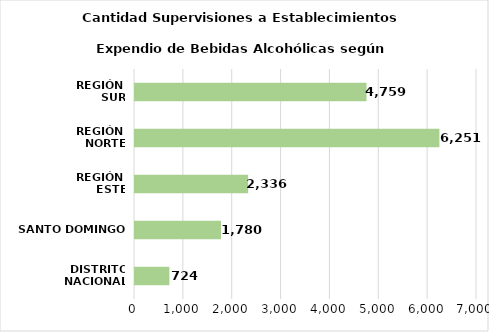
| Category | Series 0 |
|---|---|
| DISTRITO NACIONAL | 724 |
| SANTO DOMINGO | 1780 |
| REGIÓN 
ESTE | 2336 |
| REGIÓN 
NORTE | 6251 |
| REGIÓN 
SUR | 4759 |